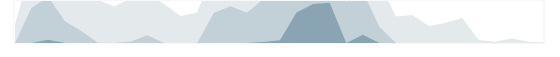
| Category | Финансы | Series 1 | Series 2 | Series 3 |
|---|---|---|---|---|
| 0.333333333333333 | 319 | 0 | 0 | 0 |
| nan | 1364 | 614 | 0 | 0 |
| nan | 1556 | 806 | 56 | 0 |
| nan | 1132 | 382 | 0 | 0 |
| 0.416666666666667 | 960 | 210 | 0 | 0 |
| nan | 755 | 5 | 0 | 0 |
| nan | 637 | 0 | 0 | 0 |
| nan | 776 | 26 | 0 | 0 |
| 0.5 | 887 | 137 | 0 | 0 |
| nan | 676 | 0 | 0 | 0 |
| nan | 472 | 0 | 0 | 0 |
| nan | 532 | 0 | 0 | 0 |
| 0.583333333333333 | 1273 | 523 | 0 | 0 |
| nan | 1393 | 643 | 0 | 0 |
| nan | 1276 | 526 | 0 | 0 |
| nan | 1518 | 768 | 18 | 0 |
| 0.666666666666667 | 1549 | 799 | 49 | 0 |
| nan | 2033 | 1283 | 533 | 0 |
| nan | 2182 | 1432 | 682 | 0 |
| nan | 2200 | 1450 | 700 | 0 |
| 0.75 | 1465 | 715 | 0 | 0 |
| nan | 1643 | 893 | 143 | 0 |
| nan | 1035 | 285 | 0 | 0 |
| nan | 462 | 0 | 0 | 0 |
| 0.833333333333333 | 490 | 0 | 0 | 0 |
| nan | 294 | 0 | 0 | 0 |
| nan | 353 | 0 | 0 | 0 |
| nan | 434 | 0 | 0 | 0 |
| 0.916666666666667 | 51 | 0 | 0 | 0 |
| nan | 20 | 0 | 0 | 0 |
| nan | 77 | 0 | 0 | 0 |
| nan | 21 | 0 | 0 | 0 |
| 0.9993055555555556 | 13 | 0 | 0 | 0 |